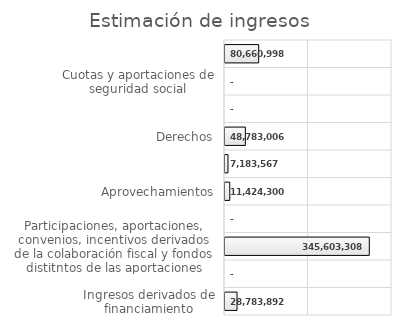
| Category | Series 0 |
|---|---|
| Ingresos derivados de financiamiento | 28783892 |
| Transferencias, asignaciones, subsidios y subvenciones y pensiones y jubilaciones | 0 |
| Participaciones, aportaciones, convenios, incentivos derivados de la colaboración fiscal y fondos distitntos de las aportaciones | 345603308 |
| Ingresos por venta de bienes, prestación de servicios y otros ingresos | 0 |
| Aprovechamientos | 11424300 |
| Productos | 7183567 |
| Derechos | 48783006 |
| Contribuciones de mejoras | 0 |
| Cuotas y aportaciones de seguridad social | 0 |
| Impuestos | 80660998 |